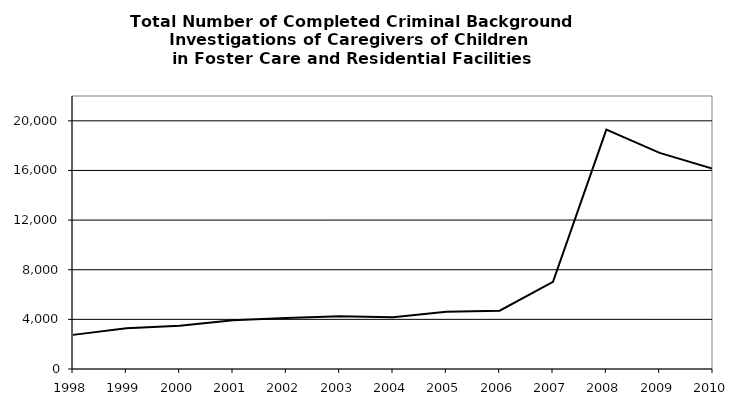
| Category | Series 0 |
|---|---|
| 1998.0 | 2750 |
| 1999.0 | 3281 |
| 2000.0 | 3480 |
| 2001.0 | 3925 |
| 2002.0 | 4102 |
| 2003.0 | 4241 |
| 2004.0 | 4180 |
| 2005.0 | 4615 |
| 2006.0 | 4696 |
| 2007.0 | 7027 |
| 2008.0 | 19290 |
| 2009.0 | 17414 |
| 2010.0 | 16132 |